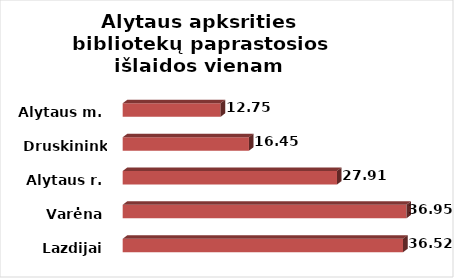
| Category | Series 0 |
|---|---|
| Lazdijai | 36.52 |
| Varėna | 36.955 |
| Alytaus r. | 27.913 |
| Druskininkai | 16.446 |
| Alytaus m. | 12.746 |